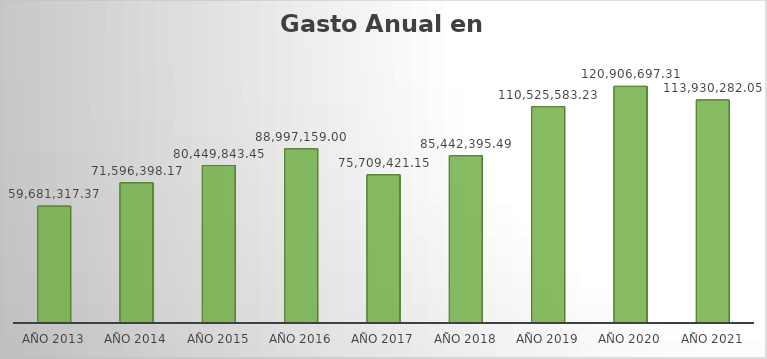
| Category | Monto |
|---|---|
| AÑO 2013 | 59681317.37 |
| AÑO 2014 | 71596398.17 |
| AÑO 2015 | 80449843.45 |
| AÑO 2016 | 88997159 |
| AÑO 2017 | 75709421.15 |
| AÑO 2018 | 85442395.49 |
| AÑO 2019 | 110525583.23 |
| AÑO 2020 | 120906697.31 |
| AÑO 2021 | 113930282.05 |